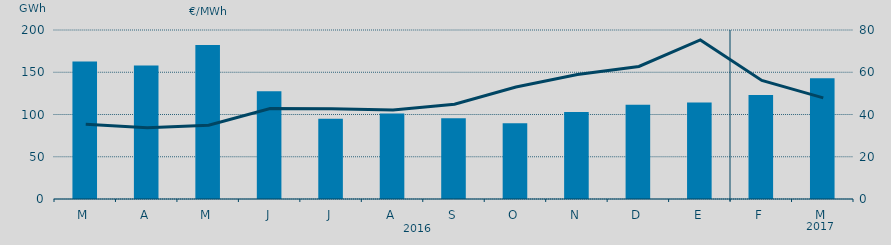
| Category | Energia (GWh) a subir |
|---|---|
| M | 162.743 |
| A | 158.011 |
| M | 182.305 |
| J | 127.443 |
| J | 94.843 |
| A | 101.252 |
| S | 95.451 |
| O | 89.66 |
| N | 103.079 |
| D | 111.653 |
| E | 114.099 |
| F | 123.064 |
| M | 142.875 |